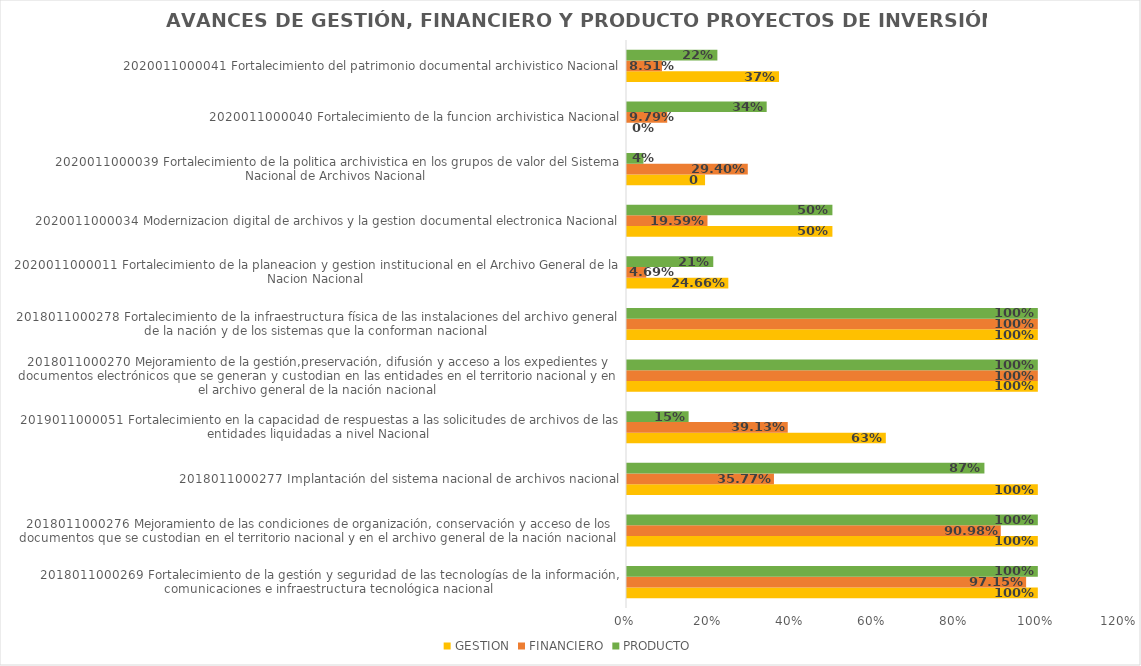
| Category | GESTION | FINANCIERO | PRODUCTO |
|---|---|---|---|
| 2018011000269 Fortalecimiento de la gestión y seguridad de las tecnologías de la información, comunicaciones e infraestructura tecnológica nacional | 1 | 0.972 | 1 |
| 2018011000276 Mejoramiento de las condiciones de organización, conservación y acceso de los documentos que se custodian en el territorio nacional y en el archivo general de la nación nacional | 1 | 0.91 | 1 |
| 2018011000277 Implantación del sistema nacional de archivos nacional | 1 | 0.358 | 0.87 |
| 2019011000051 Fortalecimiento en la capacidad de respuestas a las solicitudes de archivos de las entidades liquidadas a nivel Nacional | 0.63 | 0.391 | 0.15 |
| 2018011000270 Mejoramiento de la gestión,preservación, difusión y acceso a los expedientes y documentos electrónicos que se generan y custodian en las entidades en el territorio nacional y en el archivo general de la nación nacional | 1 | 1 | 1 |
| 2018011000278 Fortalecimiento de la infraestructura física de las instalaciones del archivo general de la nación y de los sistemas que la conforman nacional | 1 | 1 | 1 |
| 2020011000011 Fortalecimiento de la planeacion y gestion institucional en el Archivo General de la Nacion Nacional | 0.247 | 0.047 | 0.21 |
| 2020011000034 Modernizacion digital de archivos y la gestion documental electronica Nacional | 0.5 | 0.196 | 0.5 |
| 2020011000039 Fortalecimiento de la politica archivistica en los grupos de valor del Sistema Nacional de Archivos Nacional | 0.19 | 0.294 | 0.04 |
| 2020011000040 Fortalecimiento de la funcion archivistica Nacional | 0 | 0.098 | 0.34 |
| 2020011000041 Fortalecimiento del patrimonio documental archivistico Nacional | 0.37 | 0.085 | 0.22 |